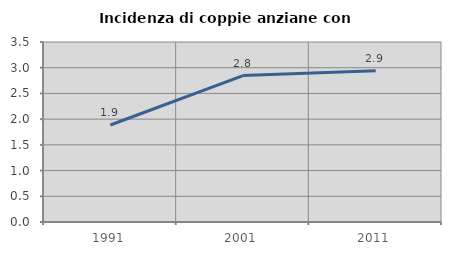
| Category | Incidenza di coppie anziane con figli |
|---|---|
| 1991.0 | 1.886 |
| 2001.0 | 2.847 |
| 2011.0 | 2.939 |